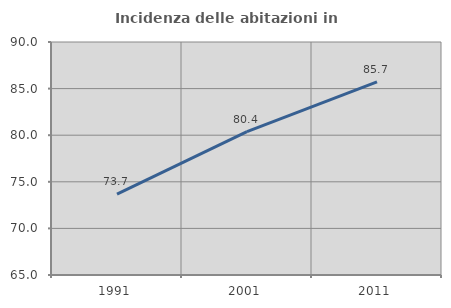
| Category | Incidenza delle abitazioni in proprietà  |
|---|---|
| 1991.0 | 73.673 |
| 2001.0 | 80.382 |
| 2011.0 | 85.714 |